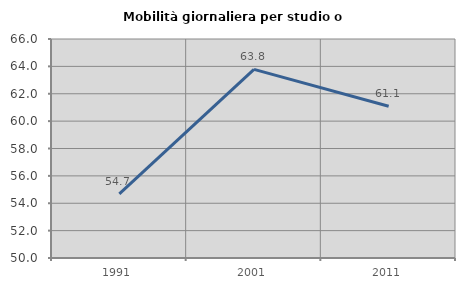
| Category | Mobilità giornaliera per studio o lavoro |
|---|---|
| 1991.0 | 54.685 |
| 2001.0 | 63.784 |
| 2011.0 | 61.083 |